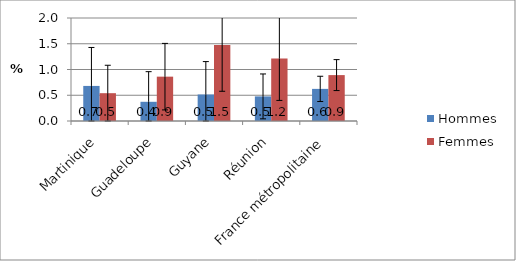
| Category | Hommes | Femmes |
|---|---|---|
| Martinique | 0.681 | 0.54 |
| Guadeloupe | 0.373 | 0.861 |
| Guyane | 0.515 | 1.476 |
| Réunion | 0.478 | 1.214 |
| France métropolitaine | 0.624 | 0.891 |